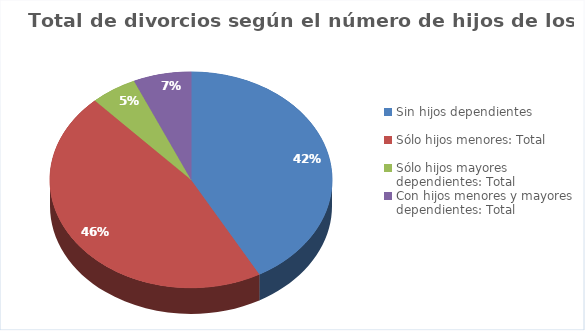
| Category | Series 0 |
|---|---|
| Sin hijos dependientes | 32392 |
| Sólo hijos menores: Total | 35605 |
| Sólo hijos mayores dependientes: Total | 4101 |
| Con hijos menores y mayores dependientes: Total | 5102 |